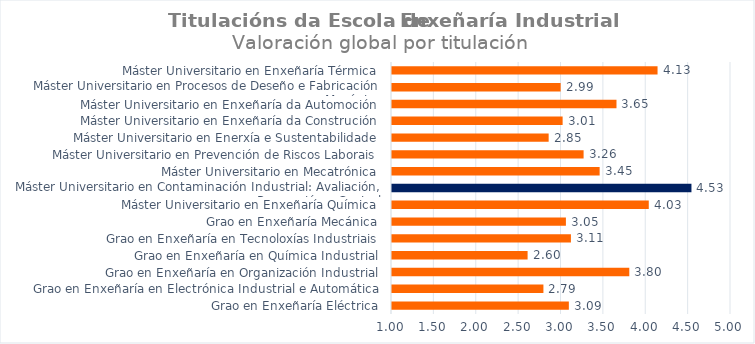
| Category | Series 0 |
|---|---|
| Grao en Enxeñaría Eléctrica | 3.087 |
| Grao en Enxeñaría en Electrónica Industrial e Automática | 2.787 |
| Grao en Enxeñaría en Organización Industrial | 3.8 |
| Grao en Enxeñaría en Química Industrial | 2.6 |
| Grao en Enxeñaría en Tecnoloxías Industriais | 3.111 |
| Grao en Enxeñaría Mecánica | 3.052 |
| Máster Universitario en Enxeñaría Química | 4.03 |
| Máster Universitario en Contaminación Industrial: Avaliación, Prevención e Control | 4.533 |
| Máster Universitario en Mecatrónica | 3.45 |
| Máster Universitario en Prevención de Riscos Laborais | 3.261 |
| Máster Universitario en Enerxía e Sustentabilidade | 2.848 |
| Máster Universitario en Enxeñaría da Construción | 3.013 |
| Máster Universitario en Enxeñaría da Automoción | 3.649 |
| Máster Universitario en Procesos de Deseño e Fabricación Mecánica | 2.99 |
| Máster Universitario en Enxeñaría Térmica | 4.133 |